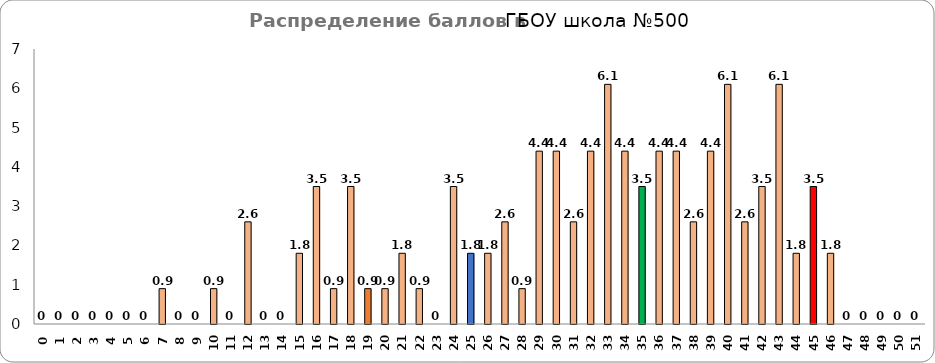
| Category | Series 0 |
|---|---|
| 0.0 | 0 |
| 1.0 | 0 |
| 2.0 | 0 |
| 3.0 | 0 |
| 4.0 | 0 |
| 5.0 | 0 |
| 6.0 | 0 |
| 7.0 | 0.9 |
| 8.0 | 0 |
| 9.0 | 0 |
| 10.0 | 0.9 |
| 11.0 | 0 |
| 12.0 | 2.6 |
| 13.0 | 0 |
| 14.0 | 0 |
| 15.0 | 1.8 |
| 16.0 | 3.5 |
| 17.0 | 0.9 |
| 18.0 | 3.5 |
| 19.0 | 0.9 |
| 20.0 | 0.9 |
| 21.0 | 1.8 |
| 22.0 | 0.9 |
| 23.0 | 0 |
| 24.0 | 3.5 |
| 25.0 | 1.8 |
| 26.0 | 1.8 |
| 27.0 | 2.6 |
| 28.0 | 0.9 |
| 29.0 | 4.4 |
| 30.0 | 4.4 |
| 31.0 | 2.6 |
| 32.0 | 4.4 |
| 33.0 | 6.1 |
| 34.0 | 4.4 |
| 35.0 | 3.5 |
| 36.0 | 4.4 |
| 37.0 | 4.4 |
| 38.0 | 2.6 |
| 39.0 | 4.4 |
| 40.0 | 6.1 |
| 41.0 | 2.6 |
| 42.0 | 3.5 |
| 43.0 | 6.1 |
| 44.0 | 1.8 |
| 45.0 | 3.5 |
| 46.0 | 1.8 |
| 47.0 | 0 |
| 48.0 | 0 |
| 49.0 | 0 |
| 50.0 | 0 |
| 51.0 | 0 |